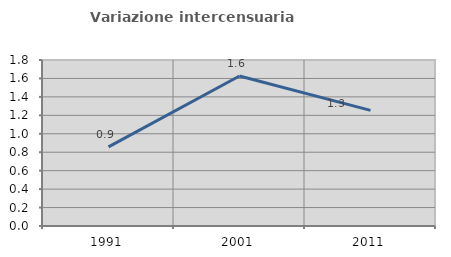
| Category | Variazione intercensuaria annua |
|---|---|
| 1991.0 | 0.858 |
| 2001.0 | 1.627 |
| 2011.0 | 1.254 |